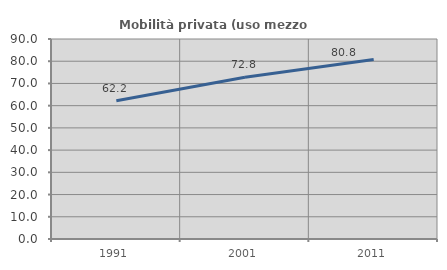
| Category | Mobilità privata (uso mezzo privato) |
|---|---|
| 1991.0 | 62.238 |
| 2001.0 | 72.791 |
| 2011.0 | 80.785 |